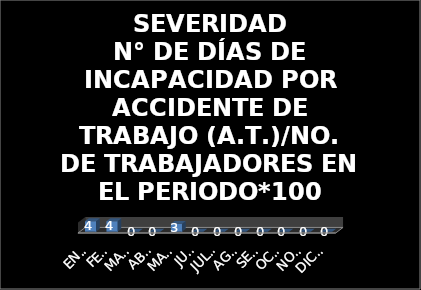
| Category | SEVERIDAD
N° DE DÍAS DE INCAPACIDAD POR ACCIDENTE DE TRABAJO (A.T.)/NO. DE TRABAJADORES EN EL PERIODO*100 |
|---|---|
| ENERO | 4 |
| FEBRERO | 4 |
| MARZO | 0 |
| ABRIL | 0 |
| MAYO | 3 |
| JUNIO | 0 |
| JULIO | 0 |
| AGOSTO | 0 |
| SEPTIEMBRE | 0 |
| OCTUBRE | 0 |
| NOVIEMBRE | 0 |
| DICIEMBRE | 0 |